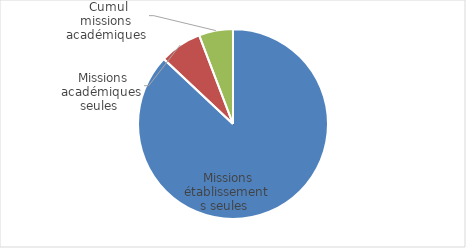
| Category | Part parmi les bénéficiaires de missions particulières |
|---|---|
| Missions établissements seules | 0.87 |
| Missions académiques seules | 0.072 |
| Cumul missions académiques et établissements | 0.058 |